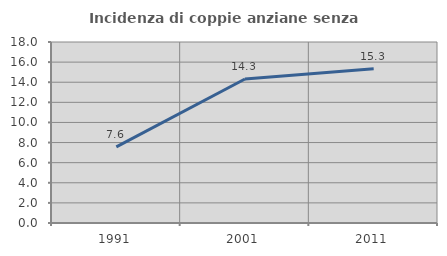
| Category | Incidenza di coppie anziane senza figli  |
|---|---|
| 1991.0 | 7.568 |
| 2001.0 | 14.323 |
| 2011.0 | 15.342 |